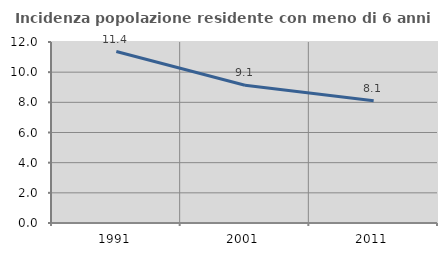
| Category | Incidenza popolazione residente con meno di 6 anni |
|---|---|
| 1991.0 | 11.367 |
| 2001.0 | 9.134 |
| 2011.0 | 8.102 |